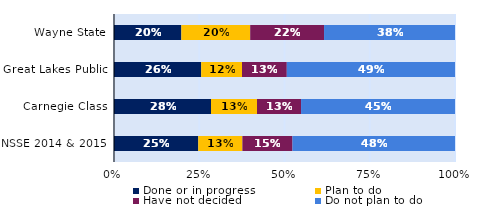
| Category | Done or in progress | Plan to do | Have not decided | Do not plan to do |
|---|---|---|---|---|
| Wayne State | 0.197 | 0.202 | 0.217 | 0.384 |
| Great Lakes Public | 0.256 | 0.12 | 0.131 | 0.493 |
| Carnegie Class | 0.284 | 0.135 | 0.129 | 0.451 |
| NSSE 2014 & 2015 | 0.247 | 0.129 | 0.147 | 0.477 |